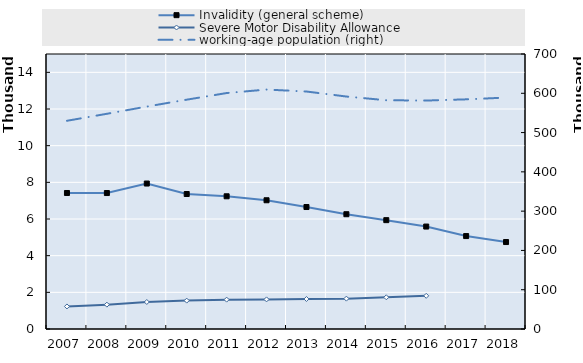
| Category | Invalidity (general scheme) | Severe Motor Disability Allowance |
|---|---|---|
| 2007.0 | 7419 | 1230 |
| 2008.0 | 7416 | 1328 |
| 2009.0 | 7934 | 1473 |
| 2010.0 | 7363 | 1548 |
| 2011.0 | 7239 | 1602 |
| 2012.0 | 7022 | 1615 |
| 2013.0 | 6653 | 1637 |
| 2014.0 | 6261 | 1656 |
| 2015.0 | 5937 | 1729 |
| 2016.0 | 5588 | 1810 |
| 2017.0 | 5069 | 0 |
| 2018.0 | 4743 | 0 |